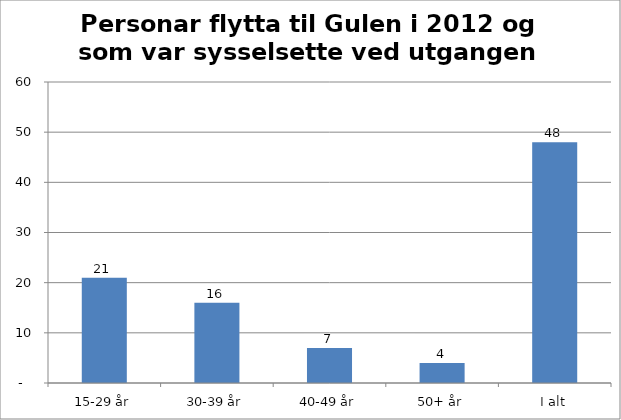
| Category | 1411 Gulen |
|---|---|
| 15-29 år | 21 |
| 30-39 år | 16 |
| 40-49 år | 7 |
| 50+ år | 4 |
| I alt | 48 |